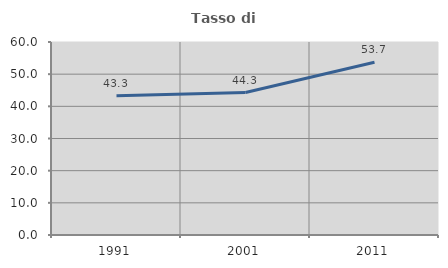
| Category | Tasso di occupazione   |
|---|---|
| 1991.0 | 43.274 |
| 2001.0 | 44.288 |
| 2011.0 | 53.68 |